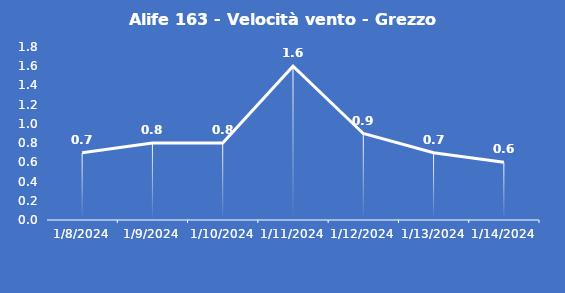
| Category | Alife 163 - Velocità vento - Grezzo (m/s) |
|---|---|
| 1/8/24 | 0.7 |
| 1/9/24 | 0.8 |
| 1/10/24 | 0.8 |
| 1/11/24 | 1.6 |
| 1/12/24 | 0.9 |
| 1/13/24 | 0.7 |
| 1/14/24 | 0.6 |